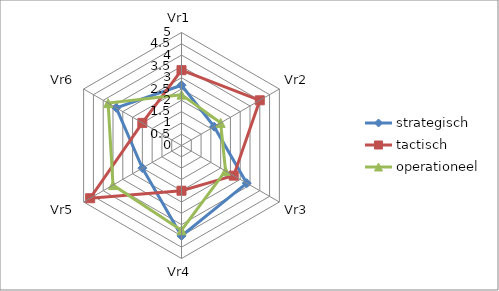
| Category | strategisch | tactisch | operationeel |
|---|---|---|---|
| Vr1 | 2.667 | 3.333 | 2.25 |
| Vr2 | 1.667 | 4 | 2 |
| Vr3 | 3.333 | 2.667 | 2.25 |
| Vr4 | 4 | 2 | 3.75 |
| Vr5 | 2 | 4.667 | 3.5 |
| Vr6 | 3.333 | 2 | 3.75 |